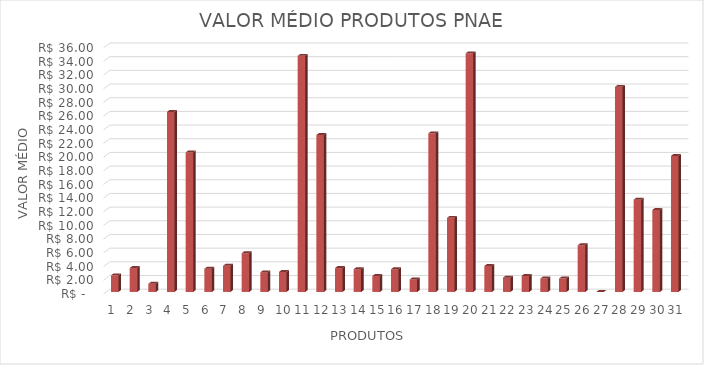
| Category | Series 0 |
|---|---|
| 0 | 2.43 |
| 1 | 3.497 |
| 2 | 1.197 |
| 3 | 26.33 |
| 4 | 20.4 |
| 5 | 3.397 |
| 6 | 3.83 |
| 7 | 5.663 |
| 8 | 2.863 |
| 9 | 2.93 |
| 10 | 34.53 |
| 11 | 22.95 |
| 12 | 3.497 |
| 13 | 3.33 |
| 14 | 2.33 |
| 15 | 3.33 |
| 16 | 1.83 |
| 17 | 23.2 |
| 18 | 10.845 |
| 19 | 34.9 |
| 20 | 3.797 |
| 21 | 2.093 |
| 22 | 2.35 |
| 23 | 1.967 |
| 24 | 1.967 |
| 25 | 6.83 |
| 26 | 0 |
| 27 | 30 |
| 28 | 13.5 |
| 29 | 11.995 |
| 30 | 19.9 |